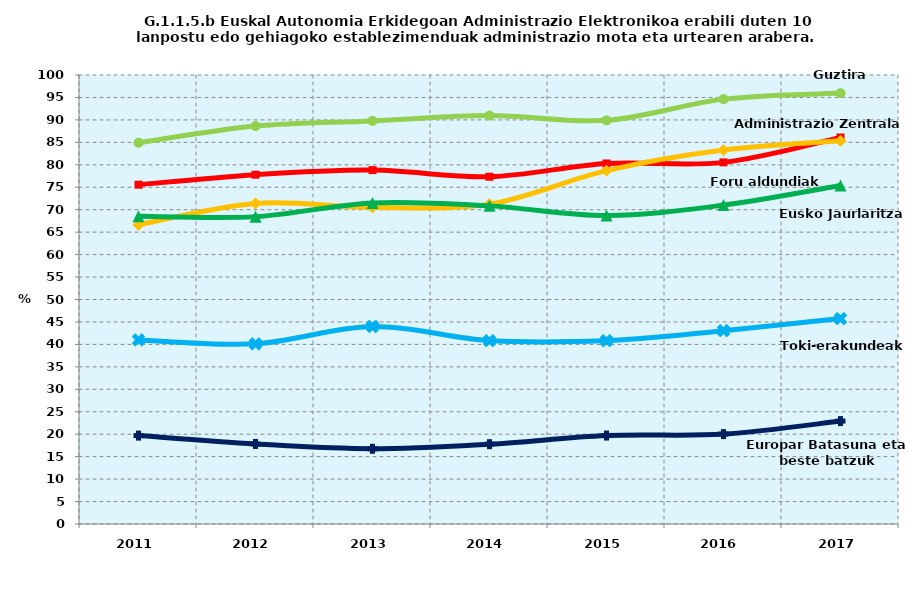
| Category | Guztira | Foru aldundiak | Administrazio Zentrala | Eusko Jaurlaritza | Toki-erakundeak | Europar Batasuna eta beste batzuk |
|---|---|---|---|---|---|---|
| 2011.0 | 84.919 | 75.566 | 66.635 | 68.518 | 40.99 | 19.69 |
| 2012.0 | 88.639 | 77.803 | 71.399 | 68.457 | 40.12 | 17.825 |
| 2013.0 | 89.774 | 78.814 | 70.5 | 71.513 | 43.99 | 16.752 |
| 2014.0 | 90.972 | 77.343 | 71.245 | 70.852 | 40.845 | 17.779 |
| 2015.0 | 89.9 | 80.3 | 78.7 | 68.7 | 40.845 | 19.7 |
| 2016.0 | 94.63 | 80.543 | 83.285 | 71.025 | 43.062 | 20.023 |
| 2017.0 | 95.964 | 86.074 | 85.341 | 75.396 | 45.758 | 22.918 |